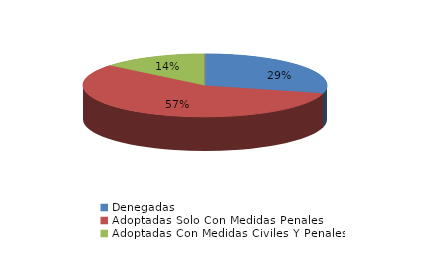
| Category | Series 0 |
|---|---|
| Denegadas | 109 |
| Adoptadas Solo Con Medidas Penales | 213 |
| Adoptadas Con Medidas Civiles Y Penales | 53 |
| Adoptadas Con Medidas Solo Civiles | 0 |